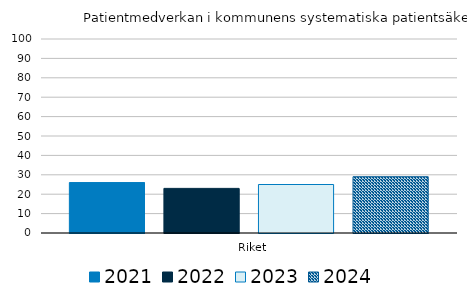
| Category | 2021 | 2022 | 2023 | 2024 |
|---|---|---|---|---|
|   Riket | 26 | 23 | 25 | 29 |